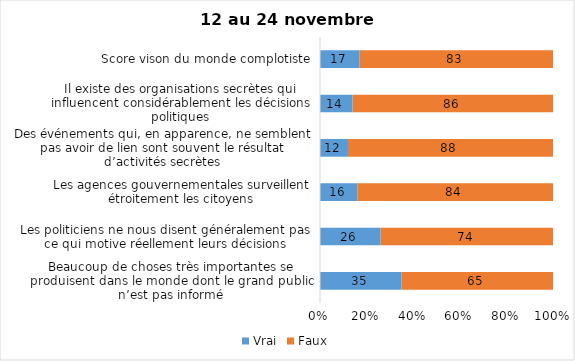
| Category | Vrai | Faux |
|---|---|---|
| Beaucoup de choses très importantes se produisent dans le monde dont le grand public n’est pas informé | 35 | 65 |
| Les politiciens ne nous disent généralement pas ce qui motive réellement leurs décisions | 26 | 74 |
| Les agences gouvernementales surveillent étroitement les citoyens | 16 | 84 |
| Des événements qui, en apparence, ne semblent pas avoir de lien sont souvent le résultat d’activités secrètes | 12 | 88 |
| Il existe des organisations secrètes qui influencent considérablement les décisions politiques | 14 | 86 |
| Score vison du monde complotiste | 17 | 83 |